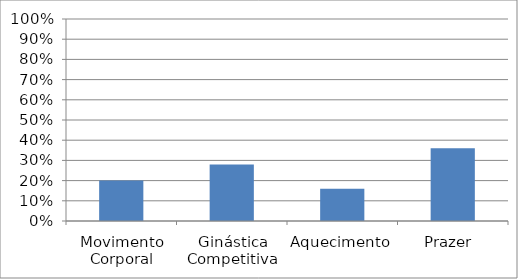
| Category | Series 0 |
|---|---|
| Movimento Corporal | 0.2 |
| Ginástica Competitiva | 0.28 |
| Aquecimento | 0.16 |
| Prazer  | 0.36 |